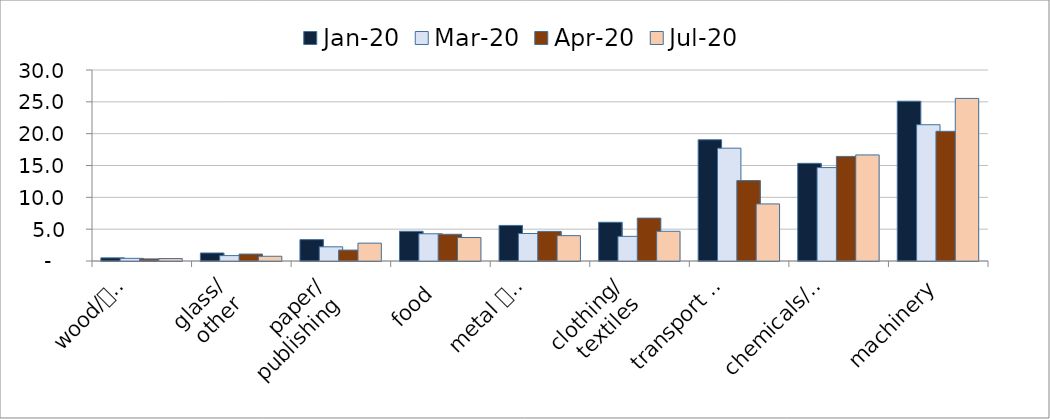
| Category | Jan-20 | Mar-20 | Apr-20 | Jul-20 |
|---|---|---|---|---|
| wood/
products | 0.495 | 0.42 | 0.327 | 0.379 |
| glass/
other | 1.26 | 0.848 | 1.09 | 0.745 |
| paper/
publishing | 3.357 | 2.231 | 1.715 | 2.803 |
| food | 4.666 | 4.277 | 4.196 | 3.685 |
| metal 
products | 5.587 | 4.316 | 4.652 | 3.983 |
| clothing/
textiles | 6.085 | 3.871 | 6.738 | 4.669 |
| transport 
eq. | 19.043 | 17.72 | 12.633 | 8.966 |
| chemicals/
plastic | 15.34 | 14.672 | 16.425 | 16.661 |
| machinery | 25.097 | 21.404 | 20.37 | 25.539 |